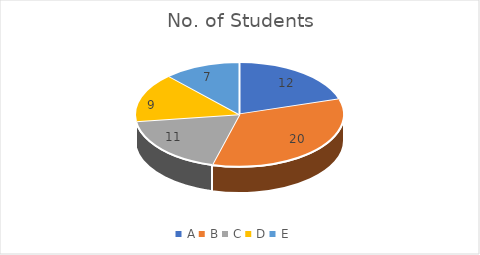
| Category |  No. of Students |
|---|---|
| A | 12 |
| B | 20 |
| C | 11 |
| D | 9 |
| E | 7 |